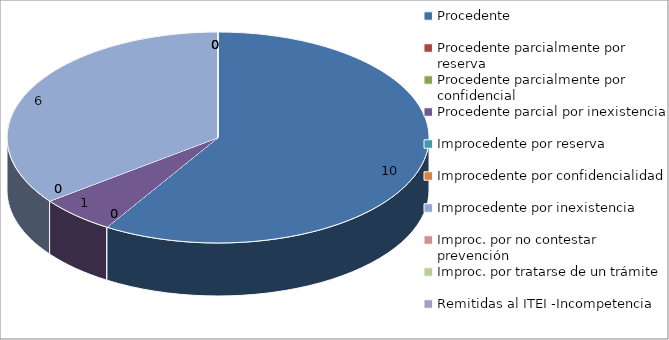
| Category | Series 0 |
|---|---|
| Procedente | 10 |
| Procedente parcialmente por reserva  | 0 |
| Procedente parcialmente por confidencial | 0 |
| Procedente parcial por inexistencia | 1 |
| Improcedente por reserva  | 0 |
| Improcedente por confidencialidad | 0 |
| Improcedente por inexistencia  | 6 |
| Improc. por no contestar prevención | 0 |
| Improc. por tratarse de un trámite  | 0 |
| Remitidas al ITEI -Incompetencia  | 0 |